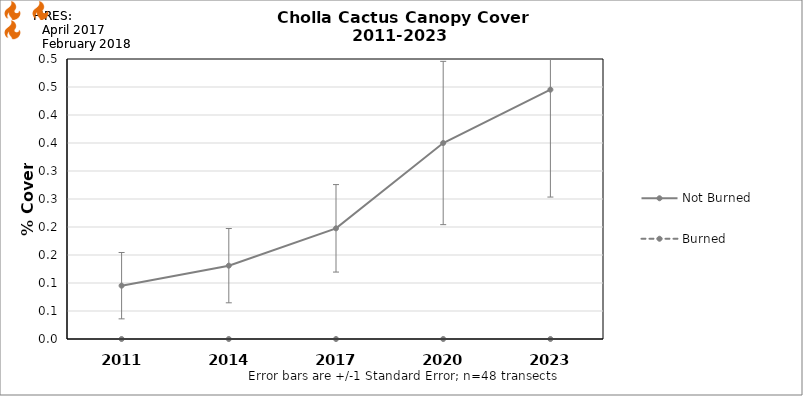
| Category | Not Burned | Burned |
|---|---|---|
| 2011.0 | 0.095 | 0 |
| 2014.0 | 0.131 | 0 |
| 2017.0 | 0.198 | 0 |
| 2020.0 | 0.35 | 0 |
| 2023.0 | 0.445 | 0 |